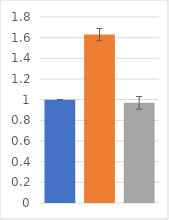
| Category | Series 0 |
|---|---|
| 0 | 1 |
| 1 | 1.63 |
| 2 | 0.97 |